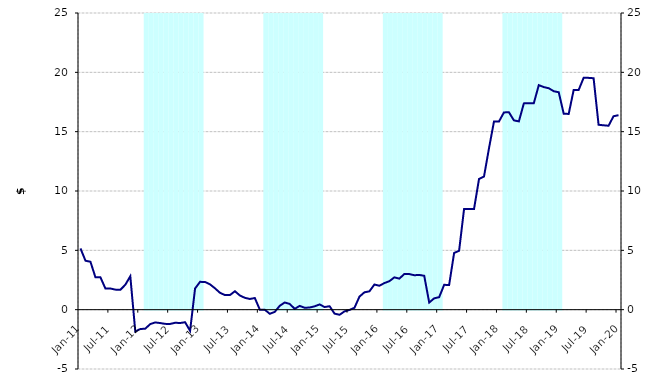
| Category | Series 1 |
|---|---|
| 0 | 0 |
| 1900-01-01 | 0 |
| 1900-01-02 | 0 |
| 1900-01-03 | 0 |
| 1900-01-04 | 0 |
| 1900-01-05 | 0 |
| 1900-01-06 | 0 |
| 1900-01-07 | 0 |
| 1900-01-08 | 0 |
| 1900-01-09 | 0 |
| 1900-01-10 | 0 |
| 1900-01-11 | 0 |
| 1900-01-12 | 0 |
| 1900-01-13 | 25000000 |
| 1900-01-14 | 25000000 |
| 1900-01-15 | 25000000 |
| 1900-01-16 | 25000000 |
| 1900-01-17 | 25000000 |
| 1900-01-18 | 25000000 |
| 1900-01-19 | 25000000 |
| 1900-01-20 | 25000000 |
| 1900-01-21 | 25000000 |
| 1900-01-22 | 25000000 |
| 1900-01-23 | 25000000 |
| 1900-01-24 | 25000000 |
| 1900-01-25 | 0 |
| 1900-01-26 | 0 |
| 1900-01-27 | 0 |
| 1900-01-28 | 0 |
| 1900-01-29 | 0 |
| 1900-01-30 | 0 |
| 1900-01-31 | 0 |
| 1900-02-01 | 0 |
| 1900-02-02 | 0 |
| 1900-02-03 | 0 |
| 1900-02-04 | 0 |
| 1900-02-05 | 0 |
| 1900-02-06 | 25000000 |
| 1900-02-07 | 25000000 |
| 1900-02-08 | 25000000 |
| 1900-02-09 | 25000000 |
| 1900-02-10 | 25000000 |
| 1900-02-11 | 25000000 |
| 1900-02-12 | 25000000 |
| 1900-02-13 | 25000000 |
| 1900-02-14 | 25000000 |
| 1900-02-15 | 25000000 |
| 1900-02-16 | 25000000 |
| 1900-02-17 | 25000000 |
| 1900-02-18 | 0 |
| 1900-02-19 | 0 |
| 1900-02-20 | 0 |
| 1900-02-21 | 0 |
| 1900-02-22 | 0 |
| 1900-02-23 | 0 |
| 1900-02-24 | 0 |
| 1900-02-25 | 0 |
| 1900-02-26 | 0 |
| 1900-02-27 | 0 |
| 1900-02-28 | 0 |
| 1900-02-28 | 0 |
| 1900-03-01 | 25000000 |
| 1900-03-02 | 25000000 |
| 1900-03-03 | 25000000 |
| 1900-03-04 | 25000000 |
| 1900-03-05 | 25000000 |
| 1900-03-06 | 25000000 |
| 1900-03-07 | 25000000 |
| 1900-03-08 | 25000000 |
| 1900-03-09 | 25000000 |
| 1900-03-10 | 25000000 |
| 1900-03-11 | 25000000 |
| 1900-03-12 | 25000000 |
| 1900-03-13 | 0 |
| 1900-03-14 | 0 |
| 1900-03-15 | 0 |
| 1900-03-16 | 0 |
| 1900-03-17 | 0 |
| 1900-03-18 | 0 |
| 1900-03-19 | 0 |
| 1900-03-20 | 0 |
| 1900-03-21 | 0 |
| 1900-03-22 | 0 |
| 1900-03-23 | 0 |
| 1900-03-24 | 0 |
| 1900-03-25 | 25000000 |
| 1900-03-26 | 25000000 |
| 1900-03-27 | 25000000 |
| 1900-03-28 | 25000000 |
| 1900-03-29 | 25000000 |
| 1900-03-30 | 25000000 |
| 1900-03-31 | 25000000 |
| 1900-04-01 | 25000000 |
| 1900-04-02 | 25000000 |
| 1900-04-03 | 25000000 |
| 1900-04-04 | 25000000 |
| 1900-04-05 | 25000000 |
| 1900-04-06 | 0 |
| 1900-04-07 | 0 |
| 1900-04-08 | 0 |
| 1900-04-09 | 0 |
| 1900-04-10 | 0 |
| 1900-04-11 | 0 |
| 1900-04-12 | 0 |
| 1900-04-13 | 0 |
| 1900-04-14 | 0 |
| 1900-04-15 | 0 |
| 1900-04-16 | 0 |
| 1900-04-17 | 0 |